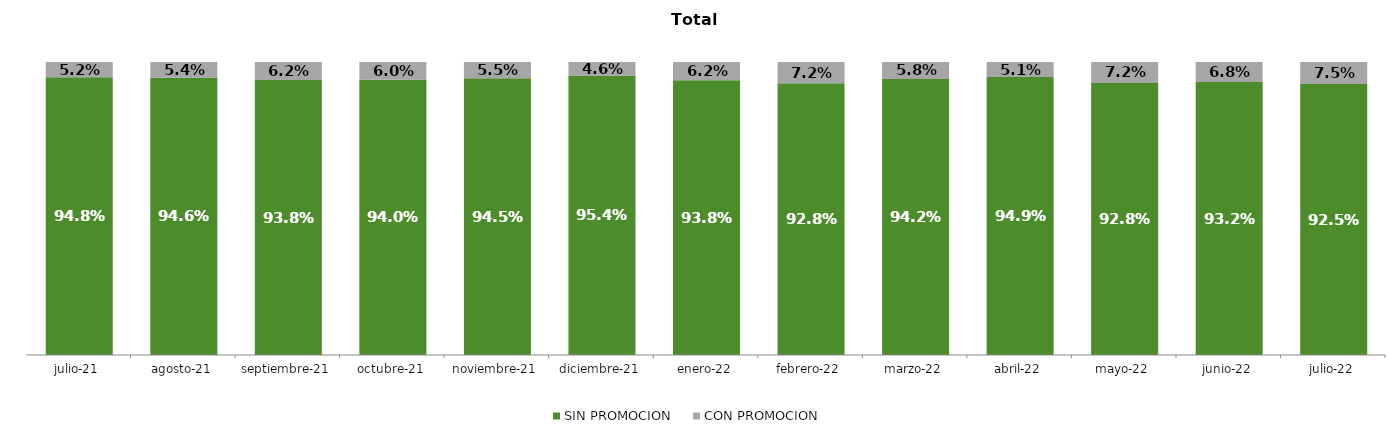
| Category | SIN PROMOCION   | CON PROMOCION   |
|---|---|---|
| 2021-07-01 | 0.948 | 0.052 |
| 2021-08-01 | 0.946 | 0.054 |
| 2021-09-01 | 0.938 | 0.062 |
| 2021-10-01 | 0.94 | 0.06 |
| 2021-11-01 | 0.945 | 0.055 |
| 2021-12-01 | 0.954 | 0.046 |
| 2022-01-01 | 0.938 | 0.062 |
| 2022-02-01 | 0.928 | 0.072 |
| 2022-03-01 | 0.942 | 0.058 |
| 2022-04-01 | 0.949 | 0.051 |
| 2022-05-01 | 0.928 | 0.072 |
| 2022-06-01 | 0.932 | 0.068 |
| 2022-07-01 | 0.925 | 0.075 |